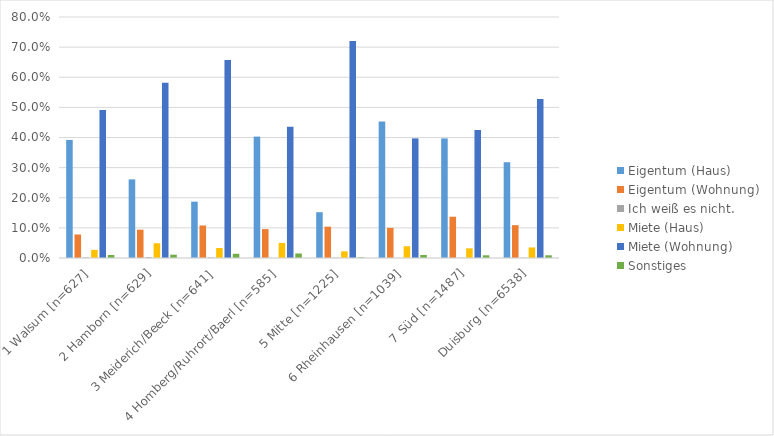
| Category | Eigentum (Haus) | Eigentum (Wohnung) | Ich weiß es nicht. | Miete (Haus) | Miete (Wohnung) | Sonstiges |
|---|---|---|---|---|---|---|
| 1 Walsum [n=627] | 0.392 | 0.078 | 0.002 | 0.027 | 0.491 | 0.01 |
| 2 Hamborn [n=629] | 0.261 | 0.094 | 0.003 | 0.049 | 0.582 | 0.011 |
| 3 Meiderich/Beeck [n=641] | 0.187 | 0.108 | 0.002 | 0.033 | 0.657 | 0.014 |
| 4 Homberg/Ruhrort/Baerl [n=585] | 0.403 | 0.096 | 0 | 0.05 | 0.436 | 0.015 |
| 5 Mitte [n=1225] | 0.152 | 0.104 | 0.001 | 0.022 | 0.72 | 0.002 |
| 6 Rheinhausen [n=1039] | 0.453 | 0.1 | 0 | 0.039 | 0.397 | 0.01 |
| 7 Süd [n=1487] | 0.397 | 0.137 | 0.001 | 0.032 | 0.425 | 0.009 |
| Duisburg [n=6538] | 0.318 | 0.109 | 0.001 | 0.035 | 0.528 | 0.009 |